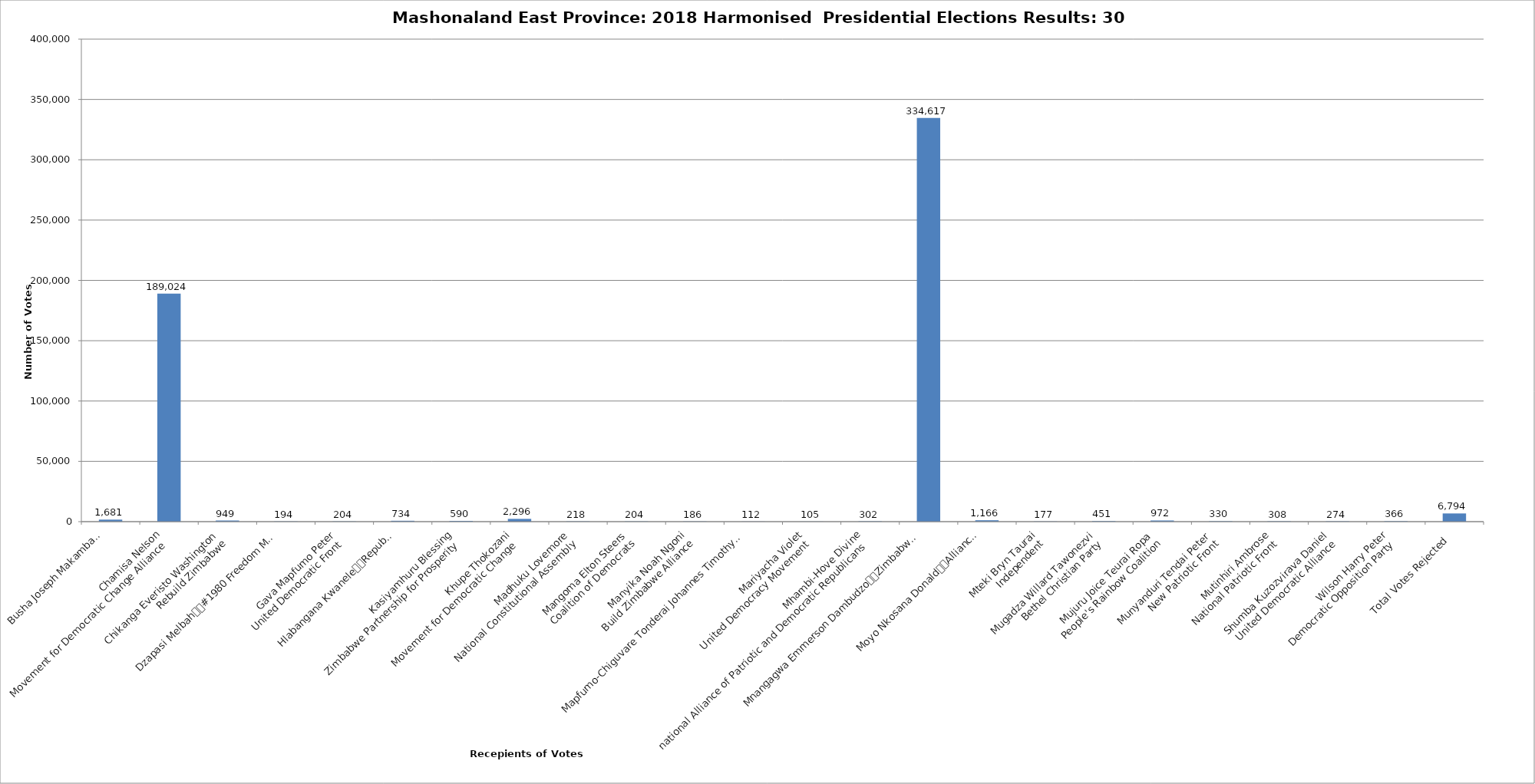
| Category | Series 0 |
|---|---|
| Busha Joseph Makamba
FreeZim Congress | 1681 |
| Chamisa Nelson
Movement for Democratic Change Alliance | 189024 |
| Chikanga Everisto Washington
Rebuild Zimbabwe | 949 |
| Dzapasi Melbah
#1980 Freedom Movement Zimbabwe | 194 |
| Gava Mapfumo Peter
United Democratic Front | 204 |
| Hlabangana Kwanele
Republican Party of Zimbabwe | 734 |
| Kasiyamhuru Blessing
Zimbabwe Partnership for Prosperity | 590 |
| Khupe Thokozani
Movement for Democratic Change | 2296 |
| Madhuku Lovemore
National Constitutional Assembly | 218 |
| Mangoma Elton Steers
Coalition of Democrats | 204 |
| Manyika Noah Ngoni
Build Zimbabwe Alliance | 186 |
| Mapfumo-Chiguvare Tonderai Johannes Timothy
People's Progressive Party Zimbabwe | 112 |
| Mariyacha Violet
United Democracy Movement | 105 |
| Mhambi-Hove Divine
national Alliance of Patriotic and Democratic Republicans | 302 |
| Mnangagwa Emmerson Dambudzo
Zimbabwe African National Union Patriotic Front | 334617 |
| Moyo Nkosana Donald
Alliance for the People's Agenda | 1166 |
| Mteki Bryn Taurai
Independent | 177 |
| Mugadza Willard Tawonezvi
Bethel Christian Party | 451 |
| Mujuru Joice Teurai Ropa
People's Rainbow Coalition | 972 |
| Munyanduri Tendai Peter
New Patriotic Front | 330 |
| Mutinhiri Ambrose
National Patriotic Front | 308 |
| Shumba Kuzozvirava Daniel
United Democratic Alliance | 274 |
| Wilson Harry Peter
Democratic Opposition Party | 366 |
| Total Votes Rejected  | 6794 |